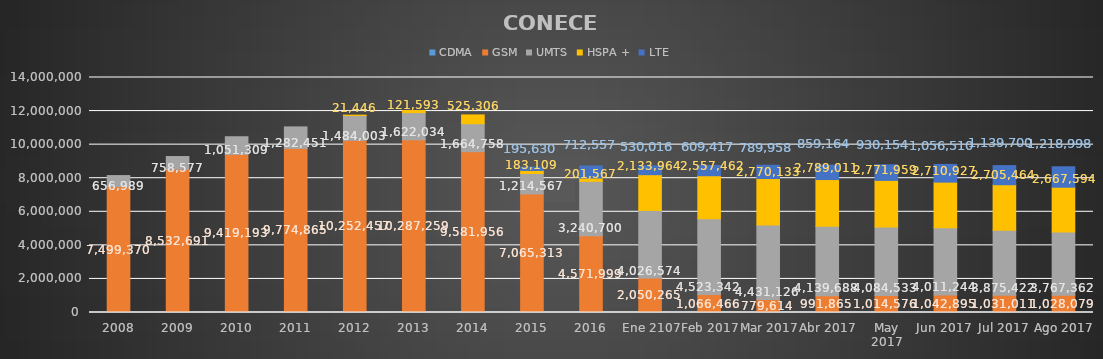
| Category | CDMA | GSM | UMTS | HSPA + | LTE |
|---|---|---|---|---|---|
| 2008 | 0 | 7499370 | 656989 | 0 | 0 |
| 2009 | 0 | 8532691 | 758577 | 0 | 0 |
| 2010 | 0 | 9419193 | 1051309 | 0 | 0 |
| 2011 | 0 | 9774865 | 1282451 | 0 | 0 |
| 2012 | 0 | 10252457 | 1484003 | 21446 | 0 |
| 2013 | 0 | 10287259 | 1622034 | 121593 | 0 |
| 2014 | 0 | 9581956 | 1664758 | 525306 | 0 |
| 2015 | 0 | 7065313 | 1214567 | 183109 | 195630 |
| 2016 | 0 | 4571999 | 3240700 | 201567 | 712557 |
| Ene 2107 | 0 | 2050264.931 | 4026574 | 2133964 | 530016 |
| Feb 2017 | 0 | 1066466 | 4523342 | 2557462 | 609417 |
| Mar 2017 | 0 | 779614 | 4431126 | 2770133 | 789958 |
| Abr 2017 | 0 | 991865 | 4139688 | 2789011 | 859164 |
| May 2017 | 0 | 1014576 | 4084533 | 2771959 | 930154 |
| Jun 2017 | 0 | 1042895 | 4011244 | 2710927 | 1056510 |
| Jul 2017 | 0 | 1031011 | 3875422 | 2705464 | 1139700 |
| Ago 2017 | 0 | 1028079 | 3767362 | 2667594 | 1218998 |